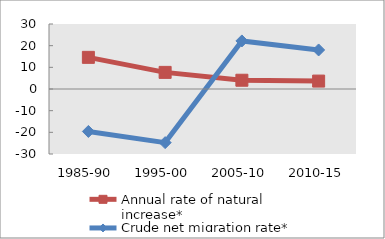
| Category | Annual rate of natural increase* | Crude net migration rate* |
|---|---|---|
| 1985-90 | 14.605 | -19.589 |
| 1995-00 | 7.67 | -24.75 |
| 2005-10 | 4.042 | 22.188 |
| 2010-15 | 3.652 | 18.017 |